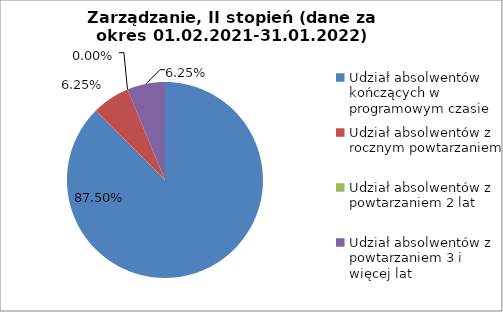
| Category | Series 0 |
|---|---|
| Udział absolwentów kończących w programowym czasie | 87.5 |
| Udział absolwentów z rocznym powtarzaniem | 6.25 |
| Udział absolwentów z powtarzaniem 2 lat | 0 |
| Udział absolwentów z powtarzaniem 3 i więcej lat | 6.25 |